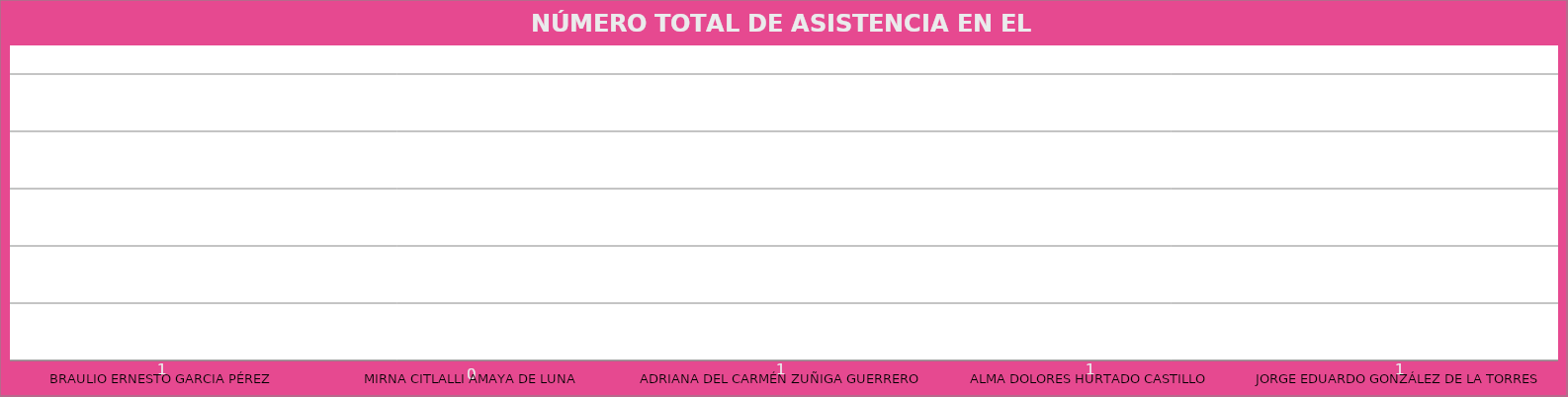
| Category | BRAULIO ERNESTO GARCIA PÉREZ |
|---|---|
| BRAULIO ERNESTO GARCIA PÉREZ | 1 |
| MIRNA CITLALLI AMAYA DE LUNA | 0 |
| ADRIANA DEL CARMÉN ZUÑIGA GUERRERO | 1 |
| ALMA DOLORES HURTADO CASTILLO | 1 |
| JORGE EDUARDO GONZÁLEZ DE LA TORRES | 1 |